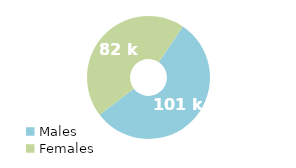
| Category | Series 0 |
|---|---|
| Males | 101 |
| Females | 82 |